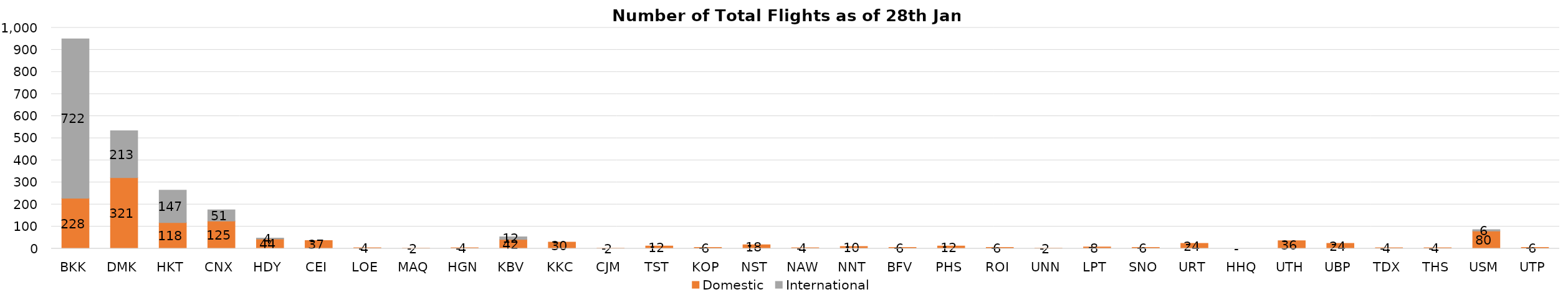
| Category | Domestic | International |
|---|---|---|
| BKK | 228 | 722 |
| DMK | 321 | 213 |
| HKT | 118 | 147 |
| CNX | 125 | 51 |
| HDY | 44 | 4 |
| CEI | 37 | 0 |
| LOE | 4 | 0 |
| MAQ | 2 | 0 |
| HGN | 4 | 0 |
| KBV | 42 | 12 |
| KKC | 30 | 0 |
| CJM | 2 | 0 |
| TST | 12 | 0 |
| KOP | 6 | 0 |
| NST | 18 | 0 |
| NAW | 4 | 0 |
| NNT | 10 | 0 |
| BFV | 6 | 0 |
| PHS | 12 | 0 |
| ROI | 6 | 0 |
| UNN | 2 | 0 |
| LPT | 8 | 0 |
| SNO | 6 | 0 |
| URT | 24 | 0 |
| HHQ | 0 | 0 |
| UTH | 36 | 0 |
| UBP | 24 | 0 |
| TDX | 4 | 0 |
| THS | 4 | 0 |
| USM | 80 | 6 |
| UTP | 6 | 0 |